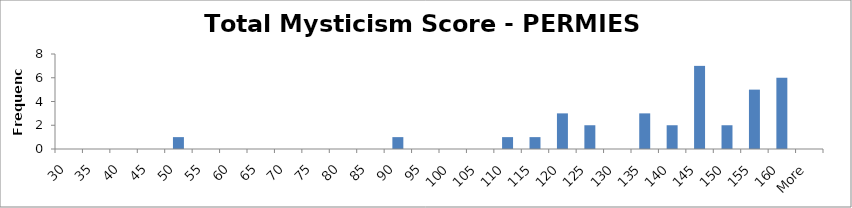
| Category | Frequency |
|---|---|
| 30 | 0 |
| 35 | 0 |
| 40 | 0 |
| 45 | 0 |
| 50 | 1 |
| 55 | 0 |
| 60 | 0 |
| 65 | 0 |
| 70 | 0 |
| 75 | 0 |
| 80 | 0 |
| 85 | 0 |
| 90 | 1 |
| 95 | 0 |
| 100 | 0 |
| 105 | 0 |
| 110 | 1 |
| 115 | 1 |
| 120 | 3 |
| 125 | 2 |
| 130 | 0 |
| 135 | 3 |
| 140 | 2 |
| 145 | 7 |
| 150 | 2 |
| 155 | 5 |
| 160 | 6 |
| More | 0 |